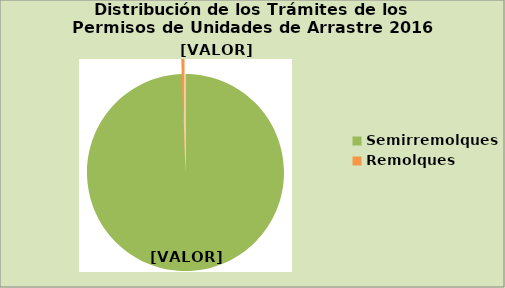
| Category | Series 0 |
|---|---|
| Semirremolques | 99.47 |
| Remolques | 0.53 |